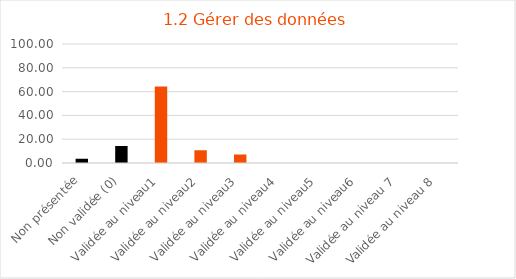
| Category | Series 0 |
|---|---|
| Non présentée | 3.571 |
| Non validée (0) | 14.286 |
| Validée au niveau1 | 64.286 |
| Validée au niveau2 | 10.714 |
| Validée au niveau3 | 7.143 |
| Validée au niveau4 | 0 |
| Validée au niveau5 | 0 |
| Validée au niveau6 | 0 |
| Validée au niveau 7 | 0 |
| Validée au niveau 8 | 0 |